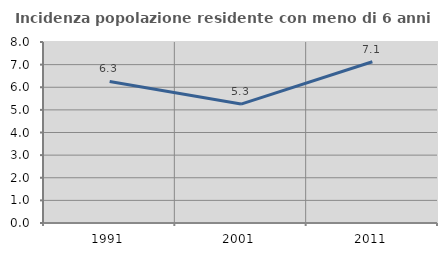
| Category | Incidenza popolazione residente con meno di 6 anni |
|---|---|
| 1991.0 | 6.258 |
| 2001.0 | 5.257 |
| 2011.0 | 7.127 |